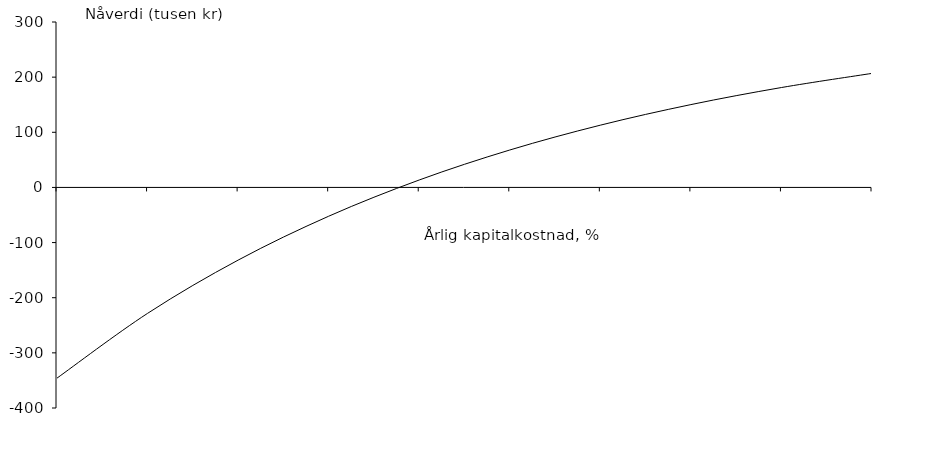
| Category | Series 0 |
|---|---|
| nan | -345.834 |
| 1.0 | -228.375 |
| 2.0 | -131.805 |
| 3.0 | -52.221 |
| 4.0 | 13.499 |
| 5.0 | 67.861 |
| 6.0 | 112.887 |
| 7.0 | 150.213 |
| 8.0 | 181.166 |
| 9.0 | 206.829 |